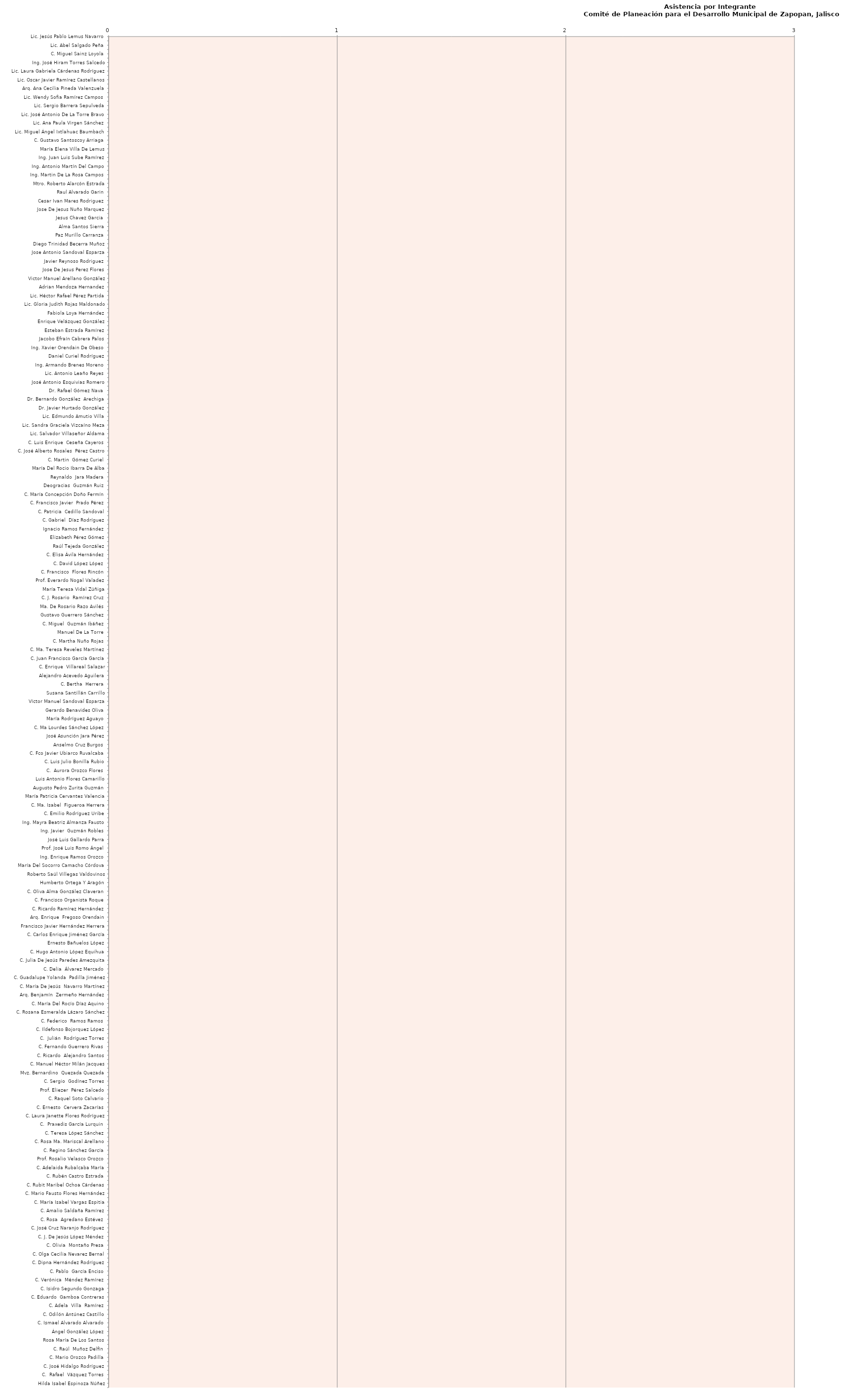
| Category | Series 0 |
|---|---|
| Lic. Jesús Pablo Lemus Navarro | 0 |
| Lic. Marcela Páramo Ortega | 0 |
| Lic. Abel Salgado Peña | 0 |
| Lic. Denisse Durán Gutiérrez | 0 |
| C. MigueI Sainz Loyola | 0 |
| Lic. Graciela De Obaldía Escalante | 0 |
| Ing. José Hiram Torres Salcedo | 0 |
| Dr. Hugo Rodríguez Díaz | 0 |
| Lic. Laura Gabriela Cárdenas Rodríguez | 0 |
| Lic. Monica Paola Magaña Mendoza | 0 |
| Lic. Oscar Javier Ramírez Castellanos | 0 |
| C. Ivan Riardo Chávez Gómez | 0 |
| Arq. Ana Cecilia Pineda Valenzuela | 0 |
| Lic. Rafael Martínez Ramírez | 0 |
| Lic. Wendy Sofia Ramírez Campos | 0 |
| Lic. Melina Alatorre Nuñez | 0 |
| Lic. Sergio Barrera Sepulveda | 0 |
| C.D.E.O. María Gómez Rueda | 0 |
| Lic. José Antonio De La Torre Bravo | 0 |
| Lic. Juan José Frangie Saade | 0 |
| Lic. Ana Paula Virgen Sánchez | 0 |
| Lic. Jaime Hernández Lamas | 0 |
| Lic. Miguel Ángel Ixtlahuac Baumbach | 0 |
| Mtra. Adriana Romo López | 0 |
| C. Gustavo Santoscoy Arriaga | 0 |
| Dr. Salvador García Uvence | 0 |
| María Elena Villa De Lemus | 0 |
| Alicia García Vázquez | 0 |
| Ing. Juan Luis Sube Ramírez | 0 |
| Lic. Luis Gerardo Asencio Rubio | 0 |
| Ing. Antonio Martín Del Campo | 0 |
| Lic. Gonzalo Alberto García Ávila | 0 |
| Ing. Martin De La Rosa Campos | 0 |
| Ing. Ismael Jauregui Castañeda | 0 |
| Mtro. Roberto Alarcón Estrada | 0 |
| Mtro. José Ángel Valdez Santiago | 0 |
| Raul Alvarado Garin | 0 |
| Elsa Paola Rubio Huerta | 0 |
| Cesar Ivan Mares Rodriguez | 0 |
| Ana Laura Mancilla Muñoz | 0 |
| Jose De Jesus Nuño Marquez | 0 |
| Maria Isabel Franco Covarrubias | 0 |
| Jesus Chavez Garcia | 0 |
| Raul Perez Oetega | 0 |
| Alma Santos Sierra | 0 |
| Jose Cornejo Valerio | 0 |
| Paz Murillo Carranza | 0 |
| Cesar Robledo Zuñiga | 0 |
| Diego Trinidad Becerra Muñoz | 0 |
| Pablo Garcia Enciso | 0 |
| Jose Antonio Sandoval Esparza | 0 |
| Cesario Garcia Limas | 0 |
| Javier Reynoso Rodriguez | 0 |
| Teresa Guzman Casillas | 0 |
| Jose De Jesus Perez Flores | 0 |
| Maria De Lourdes Vera Santos | 0 |
| Victor Manuel Arellano González | 0 |
| Karla Graciela Sierra Martinez | 0 |
| Adrian Mendoza Hernandez | 0 |
| Enrique Cadena Mora | 0 |
| Lic. Héctor Rafael Pérez Partida | 0 |
| Lic. Daviel Trujillo Cuevas | 0 |
| Lic. Gloria Judith Rojas Maldonado | 0 |
| Mario Alberto Rodríguez Carrillo | 0 |
| Fabiola Loya Hernández | 0 |
| Geraldina Isabel Herrera Vega | 0 |
| Enrique Velázquez González | 0 |
| Mirza Flores Gómez | 0 |
| Esteban Estrada Ramírez | 0 |
| Ing. Luis Méndez Jaleb | 0 |
| Jacobo Efraín Cabrera Palos | 0 |
| Lic. Miguel Ángel Landeros Volquarts | 0 |
| Ing. Xavier Orendain De Obeso | 0 |
| Lic. José Mauro Garza | 0 |
| Daniel Curiel Rodríguez | 0 |
| Dr. Adrián De León Arias | 0 |
| Ing. Armando Brenes Moreno | 0 |
| Dr. Miguel Ángel Navarro | 0 |
| Lic. Antonio Leaño Reyes | 0 |
| Pbro. Francisco Ramírez Yáñez | 0 |
| José Antonio Esquivias Romero | 0 |
| Dr. Luis Arriaga Valenzuela | 0 |
| Dr. Rafael Gómez Nava | 0 |
| Dr. Mario Adrián Flores Castro | 0 |
| Dr. Bernardo González  Arechiga | 0 |
| Dr. Roberto Carrillo López | 0 |
| Dr. Javier Hurtado González | 0 |
| Dr. Víctor González Álvarez | 0 |
| Lic. Edmundo Amutio Villa | 0 |
| Lic. Francis Bujaidar  Ghoraichy | 0 |
| Lic. Sandra Graciela Vizcaíno Meza | 0 |
| Lic. Patricia Fregoso Cruz | 0 |
| Lic. Salvador Villaseñor Aldama | 0 |
| C. Jaime  Ontiveros Guevara | 0 |
| C. Luis Enrique  Ceseña Cayeros | 0 |
| C. Ing. Omar  Contreras González | 0 |
| C. José Alberto Rosales  Pérez Castro | 0 |
| Alberto Flores Reyes | 0 |
| C. Martin  Gómez Curiel | 0 |
| Enrique Nava Hernández | 0 |
| María Del Rocio Ibarra De Alba | 0 |
| Ing. Ignacio  Gutiérrez López | 0 |
| Reynaldo  Jara Madera | 0 |
| C. Manuel Enrique Mora Alvarado | 0 |
| Deogracias  Guzmán Ruiz | 0 |
| C. Pablo  De Padua López | 0 |
| C. María Concepción Doño Fermín | 0 |
| C. Héctor Manuel  Orozco Anguiano | 0 |
| C. Francisco Javier  Prado Pérez | 0 |
| C. Fidel Amado Rangel García | 0 |
| C. Patricia  Cedillo Sandoval | 0 |
| Lic. Silvano Tello Corona | 0 |
| C. Gabriel  Díaz Rodríguez | 0 |
| Rubén Velázquez Gaytán | 0 |
| Ignacio Ramos Fernández | 0 |
| María Rosalba Rosas Cruz | 0 |
| Elizabeth Pérez Gómez | 0 |
| Daniel Guzmán Flores | 0 |
| Raúl Tejeda González | 0 |
| María Del Carmen Hernández Luna | 0 |
| C. Elisa Ávila Hernández | 0 |
| C. Guadalupe Javier González Rodríguez | 0 |
| C. David López López | 0 |
| C. María Guadalupe  De La Torre Dicante | 0 |
| C. Francisco  Flores Rincón | 0 |
| C. María Antonia Del Villar Cortes | 0 |
| Prof. Everardo Nogal Valadez | 0 |
| Marisol Moreno Doroteo | 0 |
| María Teresa Vidal Zúñiga | 0 |
| Juan Manuel Cortes Martínez | 0 |
| C. J. Rosario  Ramírez Cruz | 0 |
| María Ramona Velázquez Meza | 0 |
| Ma. De Rosario Razo Avilés | 0 |
| Beatriz Ramos Arce | 0 |
| Gustavo Guerrero Sánchez | 0 |
| Enriqueta Jiménez Flores | 0 |
| C. Miguel  Guzmán Ibáñez | 0 |
| Agustín Ortiz García | 0 |
| Manuel De La Torre | 0 |
| María Soledad Martin Del Campo Mendoza | 0 |
| C. Martha Nuño Rojas | 0 |
| C. María Del Carmen Berber León | 0 |
| C. Ma. Teresa Reveles Martínez | 0 |
| C. Aurora  Soltero Espinoza | 0 |
| C. Juan Francisco García García | 0 |
| C. María Elena Martínez Cárdenas | 0 |
| C. Enrique  Villareal Salazar | 0 |
| Karina Pérez Mercado | 0 |
| Alejandro Acevedo Aguilera | 0 |
| Arnulfo Cano Rojas | 0 |
| C. Bertha  Herrera | 0 |
| Prof. Ansurio Saldaña Castañeda | 0 |
| Susana Santillán Carrillo | 0 |
| Dr. José López Muñoz | 0 |
| Víctor Manuel Sandoval Esparza | 0 |
| Bertha Hernández Rodríguez | 0 |
| Gerardo Benavides Oliva | 0 |
| Martin Preciado Castillo | 0 |
| María Rodríguez Aguayo | 0 |
| Ma De La Luz Crisantos Castro | 0 |
| C. Ma Lourdes Sánchez López | 0 |
| Fernando Sánchez Guzmán | 0 |
| José Asunción Jara Pérez | 0 |
| C. Rosalba Robles Quintero | 0 |
| Anselmo Cruz Burgos | 0 |
| C.  Saray  Hernández Contreras | 0 |
| C. Fco Javier Ubiarco Ruvalcaba | 0 |
| C. Rosa  Hernández Díaz | 0 |
| C. Luis Julio Bonilla Rubio | 0 |
| C. Emilio Contreras Gutiérrez | 0 |
| C.  Aurora Orozco Flores | 0 |
| María Edelmira Romero Frías | 0 |
| Luis Antonio Flores Camarillo | 0 |
| Carlos Vázquez Romero | 0 |
| Augusto Pedro Zurita Guzmán | 0 |
| Alejandra Ramírez López | 0 |
| María Patricia Cervantes Valencia | 0 |
| Sonia María Fausto Martínez | 0 |
| C. Ma. Isabel  Figueroa Herrera | 0 |
| C. Emigdio  Infante Tavares | 0 |
| C. Emilio Rodríguez Uribe | 0 |
| C. María Irene Pedroza Mora | 0 |
| Ing. Mayra Beatriz Almanza Fausto | 0 |
| C. José Guadalupe López Mendoza | 0 |
| Ing. Javier  Guzmán Robles | 0 |
| Prof. Héctor Martin  Zataray Lamas | 0 |
| José Luis Gallardo Parra | 0 |
| C. Felipe Vázquez Vargas | 0 |
| Prof. José Luis Romo Ángel | 0 |
| C. Mario Olivas Barajas | 0 |
| Ing. Enrique Ramos Orozco | 0 |
| Claudia L. Flores Inda | 0 |
| María Del Socorro Camacho Córdova | 0 |
| Martha Alicia Flores Ruíz | 0 |
| Roberto Saúl Villegas Valdovinos | 0 |
| Patricia De Los Ángeles Hernández Zamudio | 0 |
| Humberto Ortega Y Aragón | 0 |
| C. David Olvera González | 0 |
| C. Oliva Alma González Claveran | 0 |
| Ing. Juan Jorge Muñiz Ramírez | 0 |
| C. Francisco Organista Roque | 0 |
| C. Petra Delgadillo Ramírez | 0 |
| C. Ricardo Ramírez Hernández | 0 |
| C. María Esther Muñoz Morales | 0 |
| Arq. Enrique  Fregoso Orendain | 0 |
| C. German Butze López Aguado | 0 |
| Francisco Javier Hernández Herrera | 0 |
| Dr. Mauricio Dueñas García | 0 |
| C. Carlos Enrique Jiménez García | 0 |
| Ing. Jorge Arturo Bárcena Sánchez | 0 |
| Ernesto Bañuelos López | 0 |
| C. Juan Francisco Mora Casillas | 0 |
| C. Hugo Antonio López Equihua | 0 |
| Dr. José Luis García González | 0 |
| C. Julia De Jesús Paredes Amezquita | 0 |
| C. Héctor Alfonso Ávila Castañeda | 0 |
| C. Delia  Álvarez Mercado | 0 |
| C. Gerald  Sheldon Dankner | 0 |
| C. Guadalupe Yolanda  Padilla Jiménez | 0 |
| C. Norma Adriana Serrano Adame | 0 |
| C. María De Jesús  Navarro Martínez | 0 |
| C. María Antonieta  Banda Canal | 0 |
| Arq. Benjamín  Zermeño Hernández | 0 |
| C. Juan Carlos Robles Sierra | 0 |
| C. María Del Rocío Díaz Aquino | 0 |
| C. Ricardo  Castellanos Narváez | 0 |
| C. Rosana Esmeralda Lázaro Sánchez | 0 |
| C. Ma. De La Luz  Palomar Reyes | 0 |
| C. Federico  Ramos Ramos | 0 |
| C. Ema  Lara Rueda | 0 |
| C. Ildefonso Bojorquez López | 0 |
| Esmeralda Girón Villalobos | 0 |
| C.  Julián  Rodríguez Torres | 0 |
| C. María  Vázquez Carbajal | 0 |
| C. Fernando Guerrero Rivas | 0 |
| C. Eleazar Najar Arenas | 0 |
| C. Ricardo  Alejandro Santos | 0 |
| C. Silvano  Pérez Arámbula | 0 |
| C. Manuel Héctor Milán Jacques | 0 |
| C. Francisca  Ruiz Cárdenas | 0 |
| Mvz. Bernardino  Quezada Quezada | 0 |
| Vicente González Robles | 0 |
| C. Sergio  Godínez Torres | 0 |
| C. German  Hernández Hernández | 0 |
| Prof. Eliezer  Pérez Salcedo | 0 |
| Francisco Becerra Ramírez | 0 |
| C. Raquel Soto Calvario | 0 |
| C. Leticia  Alvarado Aguilar | 0 |
| C. Ernesto  Cervera Zacarías | 0 |
| María De Los Ángeles Rodríguez Martínez | 0 |
| C. Laura Janette Flores Rodríguez | 0 |
| C. Martha  Vega Guzmán | 0 |
| C.  Praxedis García Lurquin | 0 |
| Alfonso Ceja Mora | 0 |
| C. Teresa López Sánchez | 0 |
| C. Ofelia  Contreras Aguilar | 0 |
| C. Rosa Ma. Mariscal Arellano | 0 |
| C. Arturo Yáñez Rodríguez | 0 |
| C. Regino Sánchez García | 0 |
| C. Fernando Suarez Vargas | 0 |
| Prof. Rosalio Velasco Orozco | 0 |
| C. Fco. Adrián González Díaz | 0 |
| C. Adelaida Rubalcaba María | 0 |
| C. Margarita Lozano Hernández | 0 |
| C. Rubén Castro Estrada | 0 |
| C. Susana Rojas Guerrero | 0 |
| C. Rubit Maribel Ochoa Cárdenas | 0 |
| C. Pedro  Villalobos Gómez | 0 |
| C. Mario Fausto Flores Hernández | 0 |
| C. Guadalupe  Hernández Martínez | 0 |
| C. María Isabel Vargas Espitia | 0 |
| Ramón Sierra Martínez | 0 |
| C. Amalio Saldaña Ramírez | 0 |
| C. Rosita De Jesús Flores Hernández | 0 |
| C. Rosa  Agredano Estévez | 0 |
| C. Pedro Sánchez Sandoval | 0 |
| C. José Cruz Naranjo Rodríguez | 0 |
| C. Ma. Reyna Sánchez López | 0 |
| C. J. De Jesús López Méndez | 0 |
| Mauricio García Lizama | 0 |
| C. Olivia  Montaño Presa | 0 |
| C. Ma. De Jesús  Garabito Ruiz | 0 |
| C. Olga Cecilia Nevarez Bernal | 0 |
| C. Juan Pablo  Pérez Vázquez | 0 |
| C. Dipna Hernández Rodríguez | 0 |
| Celestino Hidalgo | 0 |
| C. Pablo  García Enciso | 0 |
| C.  María América Martínez Langarica | 0 |
| C. Verónica  Méndez Ramírez | 0 |
| C. Yolanda Reséndiz Camacho | 0 |
| C. Isidro Segundo Gonzaga | 0 |
| C. Catalina  Rodríguez García | 0 |
| C. Eduardo  Gamboa Contreras | 0 |
| C. José Concepción Guzmán Rodríguez | 0 |
| C. Adela  Villa  Ramírez | 0 |
| C. Ma Del Carmen  Castellón Sánchez | 0 |
| C. Odilón Antúnez Castillo | 0 |
| C.  Lucio  Calvario Ramírez | 0 |
| C. Ismael Alvarado Alvarado | 0 |
| C. Luis Antonio Espinoza Saavedra | 0 |
| Ángel González López | 0 |
| C. María Del Carmen Machuca Cortez | 0 |
| Rosa María De Los Santos | 0 |
| C. Jesús Eduardo Ibarra Romero | 0 |
| C. Raúl  Muñoz Delfín | 0 |
| C. Vicente Rodríguez Julián | 0 |
| C. Mario Orozco Padilla | 0 |
| C. Blanca  Estela López | 0 |
| C. José Hidalgo Rodríguez | 0 |
| C. Alejandro  Cabrera Castañeda | 0 |
| C.  Rafael  Vázquez Torres | 0 |
| Martha Vázquez Soto | 0 |
| Hilda Isabel Espinoza Núñez | 0 |
| Antonio Murillo Solís | 0 |